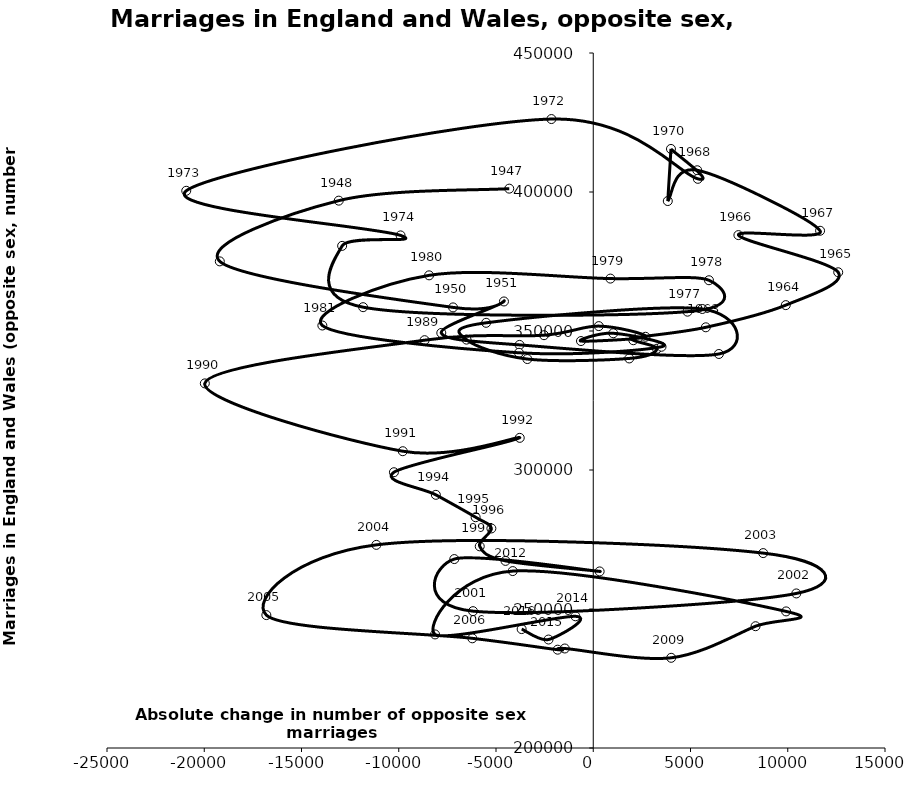
| Category | Series 0 |
|---|---|
| -4319.0 | 401210 |
| -13084.5 | 396891 |
| -19200.5 | 375041 |
| -7208.5 | 358490 |
| -4591.0 | 360624 |
| -7813.0 | 349308 |
| -3788.5 | 344998 |
| 6460.0 | 341731 |
| 5606.5 | 357918 |
| -5507.5 | 352944 |
| -6515.5 | 346903 |
| -3388.5 | 339913 |
| 1850.5 | 340126 |
| 3276.0 | 343614 |
| 2059.0 | 346678 |
| 2325.5 | 347732 |
| 5787.5 | 351329 |
| 9899.0 | 359307 |
| 12595.0 | 371127 |
| 7462.5 | 384497 |
| 11662.5 | 386052 |
| 5347.0 | 407822 |
| 3832.5 | 396746 |
| 3995.5 | 415487 |
| 5377.0 | 404737 |
| -2151.0 | 426241 |
| -20926.0 | 400435 |
| -9907.5 | 384389 |
| -12911.0 | 380620 |
| -11833.0 | 358567 |
| 4845.5 | 356954 |
| 5949.5 | 368258 |
| 882.0 | 368853 |
| -8440.0 | 370022 |
| -13928.0 | 351973 |
| -3819.5 | 342166 |
| 3510.0 | 344334 |
| 1027.5 | 349186 |
| -631.0 | 346389 |
| 2686.0 | 347924 |
| 284.0 | 351761 |
| -2532.0 | 348492 |
| -8671.0 | 346697 |
| -19970.5 | 331150 |
| -9793.0 | 306756 |
| -3779.5 | 311564 |
| -10247.5 | 299197 |
| -8092.5 | 291069 |
| -6047.0 | 283012 |
| -5238.0 | 278975 |
| -5836.0 | 272536 |
| -4510.5 | 267303 |
| 329.0 | 263515 |
| -7144.0 | 267961 |
| -6182.5 | 249227 |
| 10441.0 | 255596 |
| 8736.5 | 270109 |
| -11152.0 | 273069 |
| -16807.5 | 247805 |
| -6219.0 | 239454 |
| -1830.0 | 235367 |
| -1462.0 | 235794 |
| 4007.0 | 232443 |
| 8345.0 | 243808 |
| 9916.0 | 249133 |
| -4139.5 | 263640 |
| -8134.0 | 240854 |
| -917.0 | 247372 |
| -2299.0 | 239020 |
| -3681.0 | 242774 |